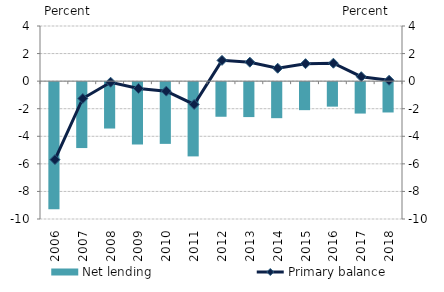
| Category | Net lending |
|---|---|
| 2006.0 | -9.221 |
| 2007.0 | -4.781 |
| 2008.0 | -3.365 |
| 2009.0 | -4.523 |
| 2010.0 | -4.478 |
| 2011.0 | -5.386 |
| 2012.0 | -2.511 |
| 2013.0 | -2.534 |
| 2014.0 | -2.614 |
| 2015.0 | -2.032 |
| 2016.0 | -1.777 |
| 2017.0 | -2.279 |
| 2018.0 | -2.2 |